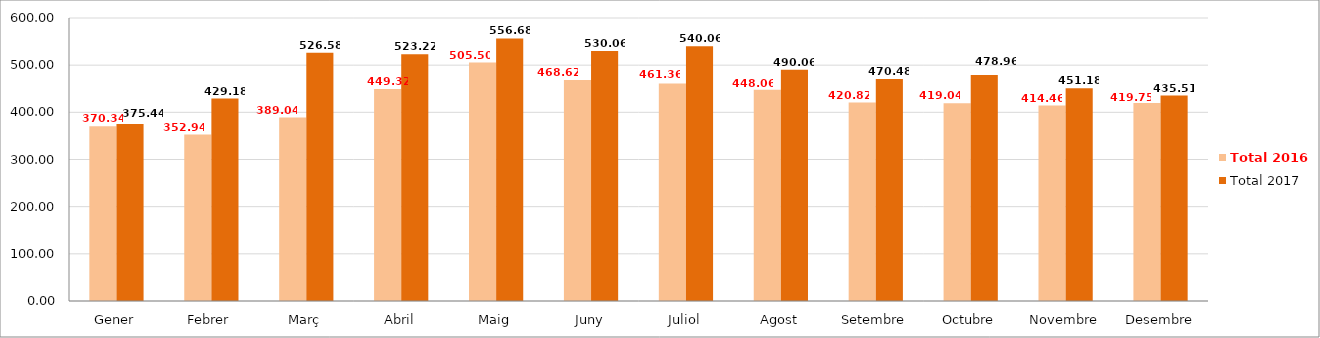
| Category | Total 2016 | Total 2017 |
|---|---|---|
| Gener | 370.34 | 375.44 |
| Febrer | 352.94 | 429.18 |
| Març | 389.04 | 526.58 |
| Abril | 449.32 | 523.22 |
| Maig | 505.5 | 556.68 |
| Juny | 468.62 | 530.059 |
| Juliol | 461.36 | 540.06 |
| Agost | 448.06 | 490.06 |
| Setembre | 420.82 | 470.48 |
| Octubre | 419.04 | 478.96 |
| Novembre | 414.46 | 451.18 |
| Desembre | 419.75 | 435.505 |